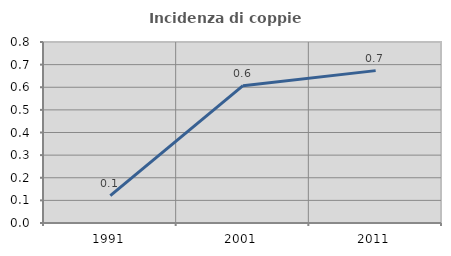
| Category | Incidenza di coppie miste |
|---|---|
| 1991.0 | 0.121 |
| 2001.0 | 0.607 |
| 2011.0 | 0.673 |